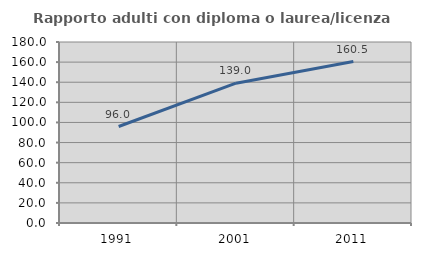
| Category | Rapporto adulti con diploma o laurea/licenza media  |
|---|---|
| 1991.0 | 95.964 |
| 2001.0 | 139.035 |
| 2011.0 | 160.529 |